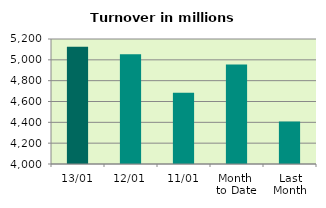
| Category | Series 0 |
|---|---|
| 13/01 | 5124.579 |
| 12/01 | 5052.732 |
| 11/01 | 4683.348 |
| Month 
to Date | 4955.514 |
| Last
Month | 4407.558 |